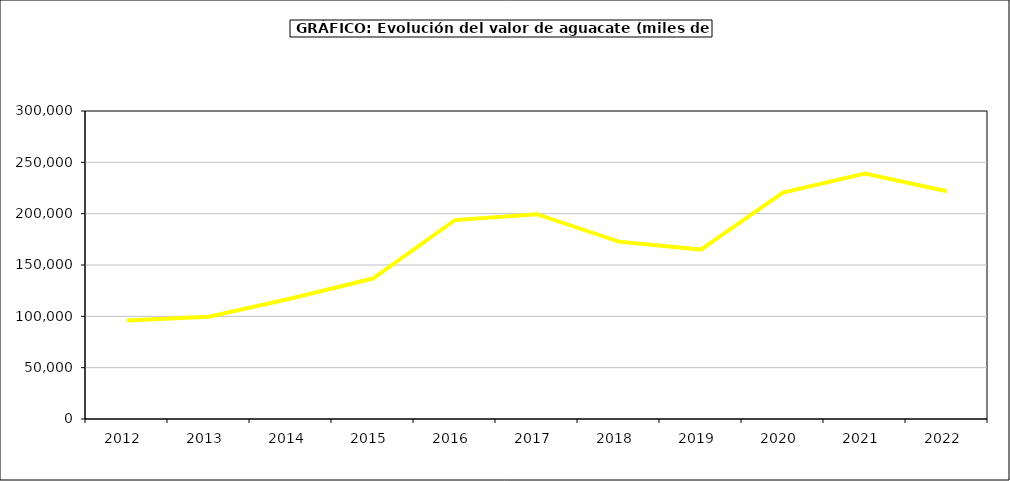
| Category | valor aguacate |
|---|---|
| 2012.0 | 96001.411 |
| 2013.0 | 99613.86 |
| 2014.0 | 117384.488 |
| 2015.0 | 136798 |
| 2016.0 | 193742 |
| 2017.0 | 199459.243 |
| 2018.0 | 172742.335 |
| 2019.0 | 164992.494 |
| 2020.0 | 220493.65 |
| 2021.0 | 239177.943 |
| 2022.0 | 221905.991 |